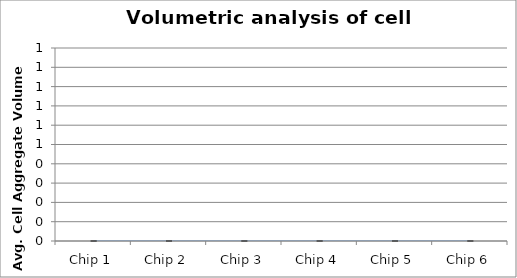
| Category | Series 1 |
|---|---|
| Chip 1 | 0 |
| Chip 2 | 0 |
| Chip 3 | 0 |
| Chip 4 | 0 |
| Chip 5 | 0 |
| Chip 6 | 0 |